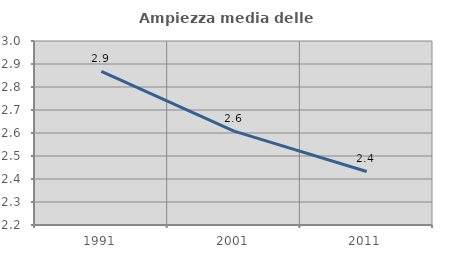
| Category | Ampiezza media delle famiglie |
|---|---|
| 1991.0 | 2.868 |
| 2001.0 | 2.608 |
| 2011.0 | 2.433 |